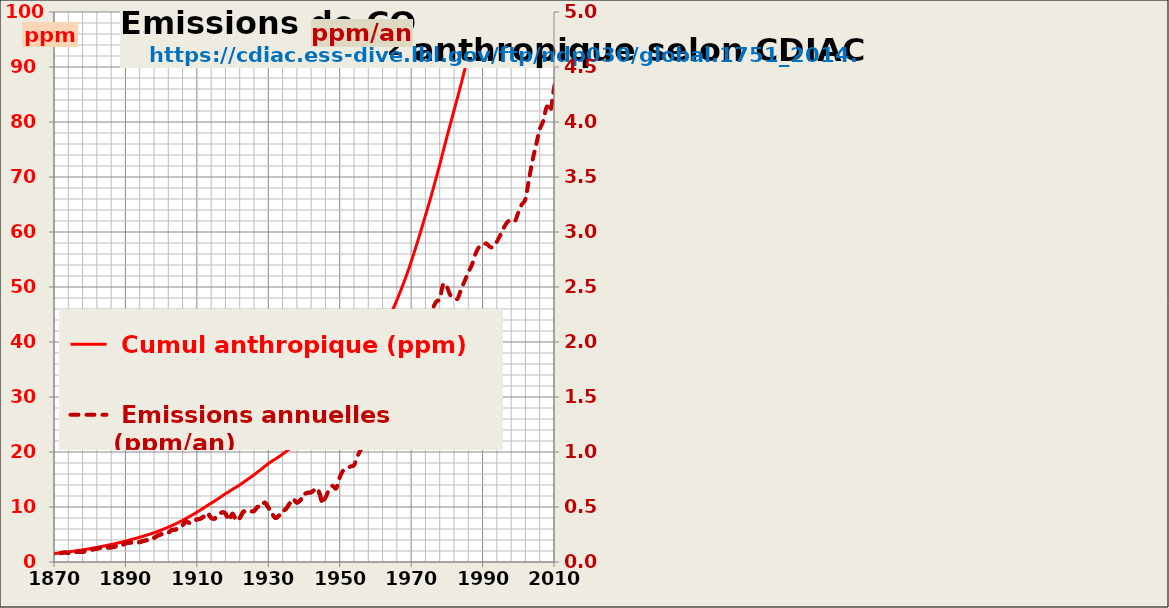
| Category |  Cumul anthropique (ppm) |
|---|---|
| 1751.0 | 0.001 |
| 1752.0 | 0.003 |
| 1753.0 | 0.004 |
| 1754.0 | 0.006 |
| 1755.0 | 0.007 |
| 1756.0 | 0.008 |
| 1757.0 | 0.01 |
| 1758.0 | 0.011 |
| 1759.0 | 0.013 |
| 1760.0 | 0.014 |
| 1761.0 | 0.016 |
| 1762.0 | 0.017 |
| 1763.0 | 0.018 |
| 1764.0 | 0.02 |
| 1765.0 | 0.021 |
| 1766.0 | 0.023 |
| 1767.0 | 0.024 |
| 1768.0 | 0.025 |
| 1769.0 | 0.027 |
| 1770.0 | 0.028 |
| 1771.0 | 0.03 |
| 1772.0 | 0.032 |
| 1773.0 | 0.034 |
| 1774.0 | 0.036 |
| 1775.0 | 0.038 |
| 1776.0 | 0.04 |
| 1777.0 | 0.042 |
| 1778.0 | 0.043 |
| 1779.0 | 0.045 |
| 1780.0 | 0.047 |
| 1781.0 | 0.05 |
| 1782.0 | 0.052 |
| 1783.0 | 0.054 |
| 1784.0 | 0.057 |
| 1785.0 | 0.059 |
| 1786.0 | 0.061 |
| 1787.0 | 0.064 |
| 1788.0 | 0.066 |
| 1789.0 | 0.068 |
| 1790.0 | 0.071 |
| 1791.0 | 0.074 |
| 1792.0 | 0.076 |
| 1793.0 | 0.079 |
| 1794.0 | 0.082 |
| 1795.0 | 0.085 |
| 1796.0 | 0.088 |
| 1797.0 | 0.091 |
| 1798.0 | 0.094 |
| 1799.0 | 0.098 |
| 1800.0 | 0.101 |
| 1801.0 | 0.105 |
| 1802.0 | 0.11 |
| 1803.0 | 0.114 |
| 1804.0 | 0.118 |
| 1805.0 | 0.123 |
| 1806.0 | 0.127 |
| 1807.0 | 0.132 |
| 1808.0 | 0.137 |
| 1809.0 | 0.142 |
| 1810.0 | 0.146 |
| 1811.0 | 0.151 |
| 1812.0 | 0.157 |
| 1813.0 | 0.162 |
| 1814.0 | 0.167 |
| 1815.0 | 0.173 |
| 1816.0 | 0.179 |
| 1817.0 | 0.185 |
| 1818.0 | 0.192 |
| 1819.0 | 0.199 |
| 1820.0 | 0.205 |
| 1821.0 | 0.212 |
| 1822.0 | 0.219 |
| 1823.0 | 0.226 |
| 1824.0 | 0.234 |
| 1825.0 | 0.242 |
| 1826.0 | 0.25 |
| 1827.0 | 0.258 |
| 1828.0 | 0.267 |
| 1829.0 | 0.275 |
| 1830.0 | 0.287 |
| 1831.0 | 0.298 |
| 1832.0 | 0.308 |
| 1833.0 | 0.32 |
| 1834.0 | 0.331 |
| 1835.0 | 0.343 |
| 1836.0 | 0.357 |
| 1837.0 | 0.37 |
| 1838.0 | 0.384 |
| 1839.0 | 0.399 |
| 1840.0 | 0.415 |
| 1841.0 | 0.431 |
| 1842.0 | 0.448 |
| 1843.0 | 0.465 |
| 1844.0 | 0.483 |
| 1845.0 | 0.504 |
| 1846.0 | 0.524 |
| 1847.0 | 0.546 |
| 1848.0 | 0.568 |
| 1849.0 | 0.592 |
| 1850.0 | 0.617 |
| 1851.0 | 0.642 |
| 1852.0 | 0.669 |
| 1853.0 | 0.697 |
| 1854.0 | 0.73 |
| 1855.0 | 0.763 |
| 1856.0 | 0.799 |
| 1857.0 | 0.835 |
| 1858.0 | 0.872 |
| 1859.0 | 0.911 |
| 1860.0 | 0.954 |
| 1861.0 | 0.999 |
| 1862.0 | 1.045 |
| 1863.0 | 1.094 |
| 1864.0 | 1.147 |
| 1865.0 | 1.203 |
| 1866.0 | 1.26 |
| 1867.0 | 1.322 |
| 1868.0 | 1.385 |
| 1869.0 | 1.452 |
| 1870.0 | 1.522 |
| 1871.0 | 1.595 |
| 1872.0 | 1.677 |
| 1873.0 | 1.764 |
| 1874.0 | 1.846 |
| 1875.0 | 1.934 |
| 1876.0 | 2.025 |
| 1877.0 | 2.116 |
| 1878.0 | 2.208 |
| 1879.0 | 2.308 |
| 1880.0 | 2.419 |
| 1881.0 | 2.533 |
| 1882.0 | 2.654 |
| 1883.0 | 2.783 |
| 1884.0 | 2.912 |
| 1885.0 | 3.043 |
| 1886.0 | 3.175 |
| 1887.0 | 3.315 |
| 1888.0 | 3.469 |
| 1889.0 | 3.623 |
| 1890.0 | 3.791 |
| 1891.0 | 3.967 |
| 1892.0 | 4.143 |
| 1893.0 | 4.317 |
| 1894.0 | 4.498 |
| 1895.0 | 4.69 |
| 1896.0 | 4.887 |
| 1897.0 | 5.095 |
| 1898.0 | 5.314 |
| 1899.0 | 5.553 |
| 1900.0 | 5.805 |
| 1901.0 | 6.066 |
| 1902.0 | 6.333 |
| 1903.0 | 6.624 |
| 1904.0 | 6.918 |
| 1905.0 | 7.231 |
| 1906.0 | 7.564 |
| 1907.0 | 7.934 |
| 1908.0 | 8.288 |
| 1909.0 | 8.658 |
| 1910.0 | 9.044 |
| 1911.0 | 9.439 |
| 1912.0 | 9.853 |
| 1913.0 | 10.298 |
| 1914.0 | 10.699 |
| 1915.0 | 11.094 |
| 1916.0 | 11.519 |
| 1917.0 | 11.97 |
| 1918.0 | 12.411 |
| 1919.0 | 12.792 |
| 1920.0 | 13.231 |
| 1921.0 | 13.61 |
| 1922.0 | 14.008 |
| 1923.0 | 14.466 |
| 1924.0 | 14.92 |
| 1925.0 | 15.38 |
| 1926.0 | 15.844 |
| 1927.0 | 16.345 |
| 1928.0 | 16.847 |
| 1929.0 | 17.387 |
| 1930.0 | 17.884 |
| 1931.0 | 18.327 |
| 1932.0 | 18.727 |
| 1933.0 | 19.148 |
| 1934.0 | 19.607 |
| 1935.0 | 20.092 |
| 1936.0 | 20.625 |
| 1937.0 | 21.195 |
| 1938.0 | 21.733 |
| 1939.0 | 22.296 |
| 1940.0 | 22.908 |
| 1941.0 | 23.538 |
| 1942.0 | 24.171 |
| 1943.0 | 24.827 |
| 1944.0 | 25.479 |
| 1945.0 | 26.026 |
| 1946.0 | 26.61 |
| 1947.0 | 27.267 |
| 1948.0 | 27.96 |
| 1949.0 | 28.629 |
| 1950.0 | 29.398 |
| 1951.0 | 30.232 |
| 1952.0 | 31.078 |
| 1953.0 | 31.947 |
| 1954.0 | 32.826 |
| 1955.0 | 33.79 |
| 1956.0 | 34.817 |
| 1957.0 | 35.887 |
| 1958.0 | 36.986 |
| 1959.0 | 38.144 |
| 1960.0 | 39.356 |
| 1961.0 | 40.573 |
| 1962.0 | 41.84 |
| 1963.0 | 43.176 |
| 1964.0 | 44.589 |
| 1965.0 | 46.065 |
| 1966.0 | 47.616 |
| 1967.0 | 49.217 |
| 1968.0 | 50.899 |
| 1969.0 | 52.682 |
| 1970.0 | 54.593 |
| 1971.0 | 56.578 |
| 1972.0 | 58.642 |
| 1973.0 | 60.819 |
| 1974.0 | 63 |
| 1975.0 | 65.167 |
| 1976.0 | 67.462 |
| 1977.0 | 69.828 |
| 1978.0 | 72.221 |
| 1979.0 | 74.748 |
| 1980.0 | 77.249 |
| 1981.0 | 79.672 |
| 1982.0 | 82.075 |
| 1983.0 | 84.469 |
| 1984.0 | 86.949 |
| 1985.0 | 89.504 |
| 1986.0 | 92.138 |
| 1987.0 | 94.838 |
| 1988.0 | 97.638 |
| 1989.0 | 100.5 |
| 1990.0 | 103.365 |
| 1991.0 | 106.262 |
| 1992.0 | 109.129 |
| 1993.0 | 111.992 |
| 1994.0 | 114.904 |
| 1995.0 | 117.878 |
| 1996.0 | 120.92 |
| 1997.0 | 124.012 |
| 1998.0 | 127.114 |
| 1999.0 | 130.209 |
| 2000.0 | 133.385 |
| 2001.0 | 136.636 |
| 2002.0 | 139.935 |
| 2003.0 | 143.415 |
| 2004.0 | 147.067 |
| 2005.0 | 150.86 |
| 2006.0 | 154.792 |
| 2007.0 | 158.803 |
| 2008.0 | 162.943 |
| 2009.0 | 167.045 |
| 2010.0 | 171.351 |
| 2011.0 | 175.833 |
| 2012.0 | 180.396 |
| 2013.0 | 185.006 |
| 2014.0 | 189.655 |